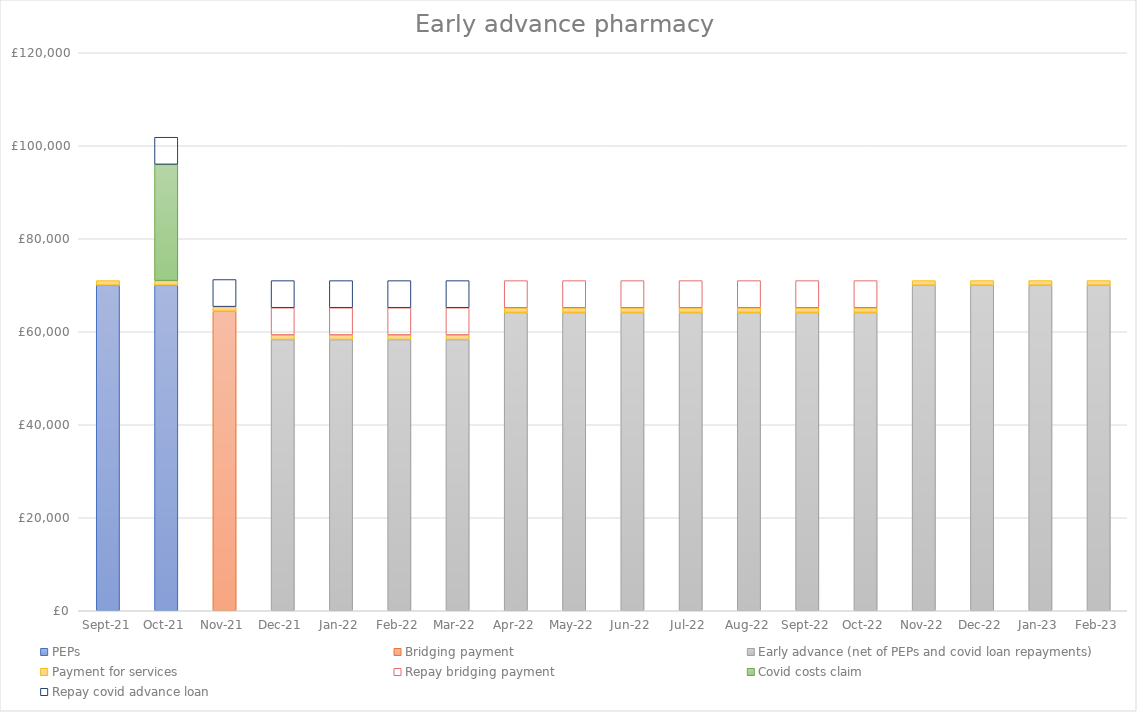
| Category | PEPs | Bridging payment | Early advance (net of PEPs and covid loan repayments) | Payment for services | Repay bridging payment | Covid costs claim | Repay covid advance loan |
|---|---|---|---|---|---|---|---|
| 2021-09-01 | 70000 | 0 | 0 | 1000 | 0 | 0 | 0 |
| 2021-10-01 | 70000 | 0 | 0 | 1000 | 0 | 25000 | 5833.333 |
| 2021-11-01 | 0 | 64400 | 0 | 1000 | 0 | 0 | 5833.333 |
| 2021-12-01 | 0 | 0 | 58312.121 | 1000 | 5854.545 | 0 | 5833.333 |
| 2022-01-01 | 0 | 0 | 58312.121 | 1000 | 5854.545 | 0 | 5833.333 |
| 2022-02-01 | 0 | 0 | 58312.121 | 1000 | 5854.545 | 0 | 5833.333 |
| 2022-03-01 | 0 | 0 | 58312.121 | 1000 | 5854.545 | 0 | 5833.333 |
| 2022-04-01 | 0 | 0 | 64145.455 | 1000 | 5854.545 | 0 | 0 |
| 2022-05-01 | 0 | 0 | 64145.455 | 1000 | 5854.545 | 0 | 0 |
| 2022-06-01 | 0 | 0 | 64145.455 | 1000 | 5854.545 | 0 | 0 |
| 2022-07-01 | 0 | 0 | 64145.455 | 1000 | 5854.545 | 0 | 0 |
| 2022-08-01 | 0 | 0 | 64145.455 | 1000 | 5854.545 | 0 | 0 |
| 2022-09-01 | 0 | 0 | 64145.455 | 1000 | 5854.545 | 0 | 0 |
| 2022-10-01 | 0 | 0 | 64145.455 | 1000 | 5854.545 | 0 | 0 |
| 2022-11-01 | 0 | 0 | 70000 | 1000 | 0 | 0 | 0 |
| 2022-12-01 | 0 | 0 | 70000 | 1000 | 0 | 0 | 0 |
| 2023-01-01 | 0 | 0 | 70000 | 1000 | 0 | 0 | 0 |
| 2023-02-01 | 0 | 0 | 70000 | 1000 | 0 | 0 | 0 |